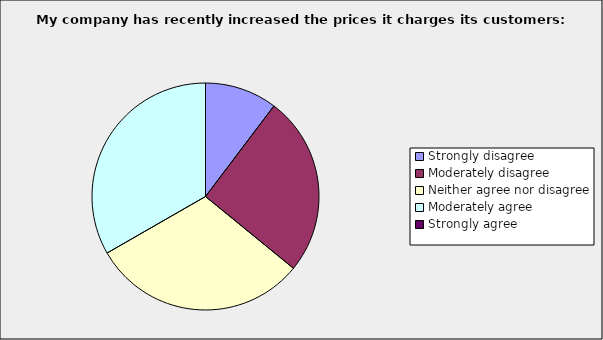
| Category | Series 0 |
|---|---|
| Strongly disagree | 0.103 |
| Moderately disagree | 0.256 |
| Neither agree nor disagree | 0.308 |
| Moderately agree | 0.333 |
| Strongly agree | 0 |